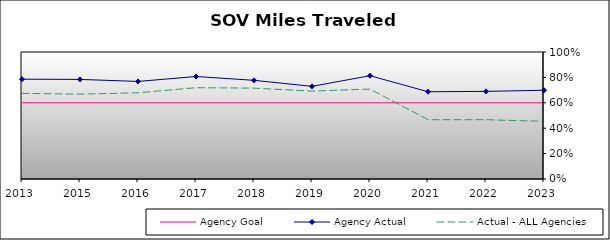
| Category | Agency Goal | Agency Actual | Actual - ALL Agencies |
|---|---|---|---|
| 2013.0 | 0.6 | 0.786 | 0.674 |
| 2015.0 | 0.6 | 0.784 | 0.668 |
| 2016.0 | 0.6 | 0.768 | 0.679 |
| 2017.0 | 0.6 | 0.807 | 0.719 |
| 2018.0 | 0.6 | 0.777 | 0.715 |
| 2019.0 | 0.6 | 0.73 | 0.692 |
| 2020.0 | 0.6 | 0.813 | 0.708 |
| 2021.0 | 0.6 | 0.687 | 0.467 |
| 2022.0 | 0.6 | 0.69 | 0.467 |
| 2023.0 | 0.6 | 0.699 | 0.454 |